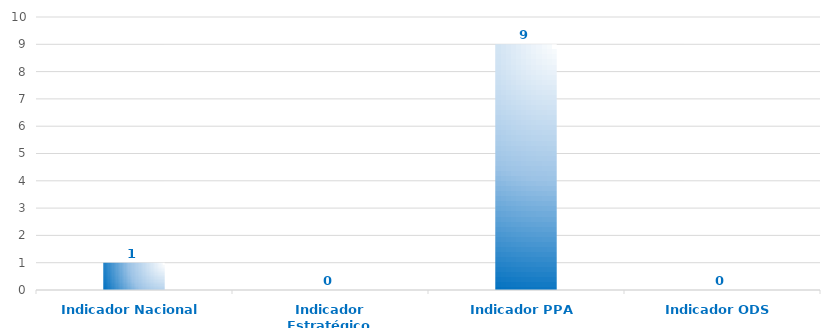
| Category | Series 0 |
|---|---|
| Indicador Nacional | 1 |
| Indicador Estratégico | 0 |
| Indicador PPA | 9 |
| Indicador ODS | 0 |